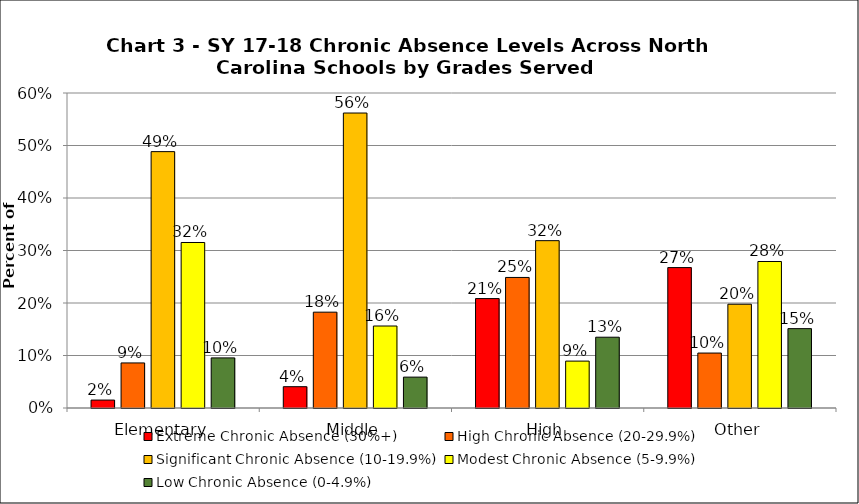
| Category | Extreme Chronic Absence (30%+) | High Chronic Absence (20-29.9%) | Significant Chronic Absence (10-19.9%) | Modest Chronic Absence (5-9.9%) | Low Chronic Absence (0-4.9%) |
|---|---|---|---|---|---|
| 0 | 0.015 | 0.086 | 0.488 | 0.315 | 0.095 |
| 1 | 0.041 | 0.183 | 0.562 | 0.156 | 0.059 |
| 2 | 0.208 | 0.249 | 0.319 | 0.089 | 0.135 |
| 3 | 0.267 | 0.105 | 0.198 | 0.279 | 0.151 |